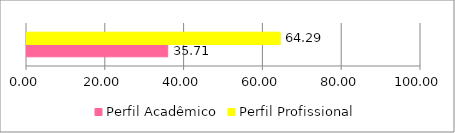
| Category | Perfil Acadêmico | Perfil Profissional |
|---|---|---|
| 0 | 35.714 | 64.286 |